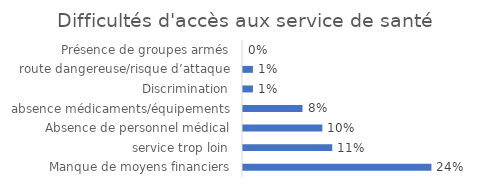
| Category | Fréquence |
|---|---|
| Manque de moyens financiers | 0.238 |
| service trop loin | 0.112 |
| Absence de personnel médical | 0.1 |
| absence médicaments/équipements | 0.075 |
| Discrimination | 0.012 |
| route dangereuse/risque d’attaque | 0.012 |
| Présence de groupes armés | 0 |